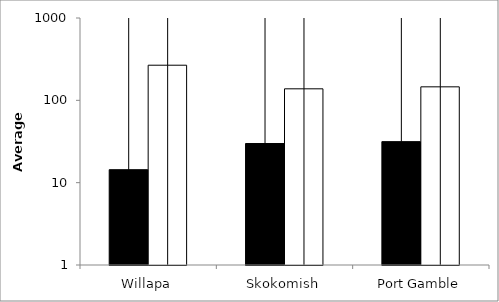
| Category | Video | Seine |
|---|---|---|
| Willapa | 14.375 | 267 |
| Skokomish | 29.889 | 138 |
| Port Gamble | 31.5 | 145.889 |